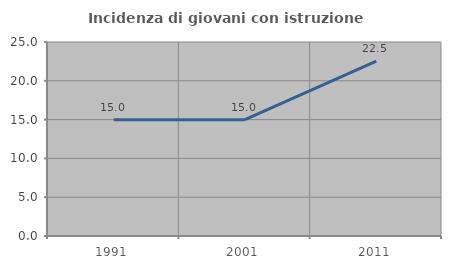
| Category | Incidenza di giovani con istruzione universitaria |
|---|---|
| 1991.0 | 14.985 |
| 2001.0 | 14.986 |
| 2011.0 | 22.535 |